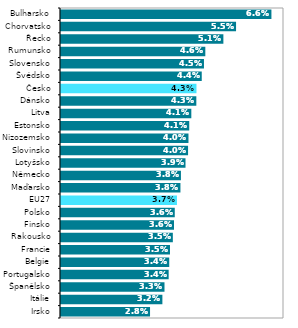
| Category | Series 1 |
|---|---|
| Irsko | 0.028 |
| Itálie | 0.032 |
| Španělsko | 0.033 |
| Portugalsko | 0.034 |
| Belgie | 0.034 |
| Francie | 0.035 |
| Rakousko | 0.035 |
| Finsko | 0.036 |
| Polsko | 0.036 |
| EU27 | 0.037 |
| Maďarsko | 0.038 |
| Německo | 0.038 |
| Lotyšsko | 0.039 |
| Slovinsko | 0.04 |
| Nizozemsko | 0.04 |
| Estonsko | 0.041 |
| Litva | 0.041 |
| Dánsko | 0.043 |
| Česko | 0.043 |
| Švédsko | 0.044 |
| Slovensko | 0.045 |
| Rumunsko | 0.046 |
| Řecko | 0.051 |
| Chorvatsko | 0.055 |
| Bulharsko | 0.066 |